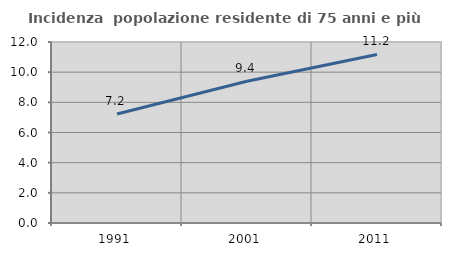
| Category | Incidenza  popolazione residente di 75 anni e più |
|---|---|
| 1991.0 | 7.223 |
| 2001.0 | 9.403 |
| 2011.0 | 11.176 |